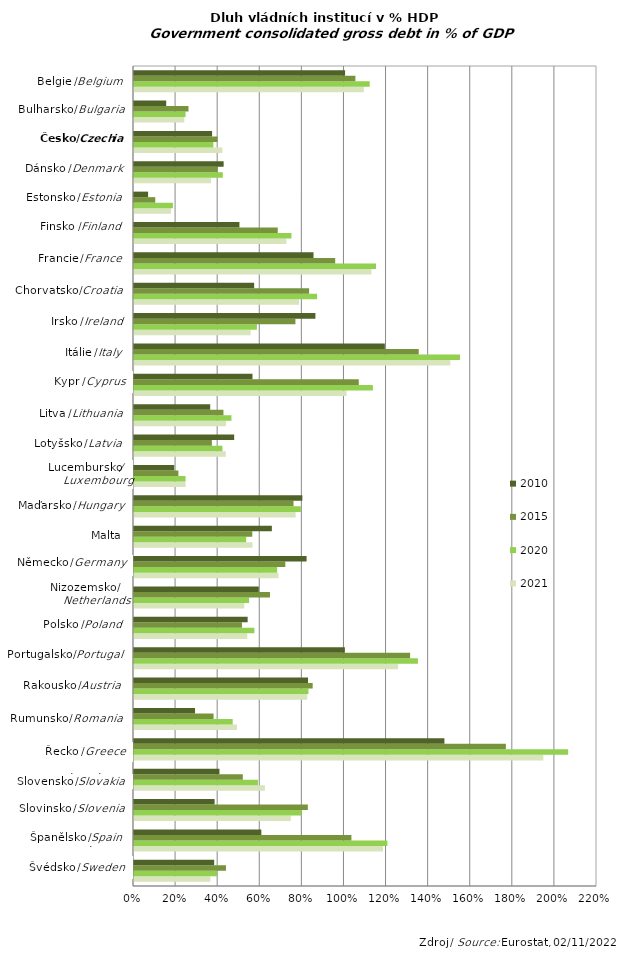
| Category | 2021 | 2020 | 2015 | 2010 |
|---|---|---|---|---|
| Sweden | 0.363 | 0.395 | 0.437 | 0.381 |
| Spain | 1.183 | 1.204 | 1.033 | 0.605 |
| Slovenia | 0.745 | 0.796 | 0.826 | 0.383 |
| Slovakia | 0.622 | 0.589 | 0.517 | 0.406 |
| Greece | 1.945 | 2.063 | 1.767 | 1.475 |
| Romania | 0.489 | 0.469 | 0.378 | 0.29 |
| Austria | 0.823 | 0.829 | 0.849 | 0.827 |
| Portugal | 1.255 | 1.349 | 1.312 | 1.002 |
| Poland | 0.538 | 0.572 | 0.513 | 0.54 |
| Netherlands | 0.524 | 0.547 | 0.646 | 0.593 |
| Germany | 0.686 | 0.68 | 0.719 | 0.82 |
| Malta | 0.563 | 0.533 | 0.562 | 0.655 |
| Hungary | 0.768 | 0.793 | 0.758 | 0.8 |
| Luxembourg | 0.245 | 0.245 | 0.211 | 0.191 |
| Latvia | 0.436 | 0.42 | 0.37 | 0.476 |
| Lithuania | 0.437 | 0.463 | 0.425 | 0.362 |
| Cyprus | 1.01 | 1.135 | 1.068 | 0.563 |
| Italy | 1.503 | 1.549 | 1.353 | 1.192 |
| Ireland | 0.554 | 0.584 | 0.767 | 0.862 |
| Croatia | 0.784 | 0.87 | 0.832 | 0.571 |
| France | 1.128 | 1.15 | 0.956 | 0.853 |
| Finland | 0.724 | 0.748 | 0.683 | 0.501 |
| Estonia | 0.176 | 0.185 | 0.101 | 0.067 |
| Denmark | 0.366 | 0.422 | 0.398 | 0.426 |
| Czechia | 0.42 | 0.377 | 0.397 | 0.371 |
| Bulgaria | 0.239 | 0.245 | 0.259 | 0.153 |
| Belgium | 1.092 | 1.12 | 1.052 | 1.003 |